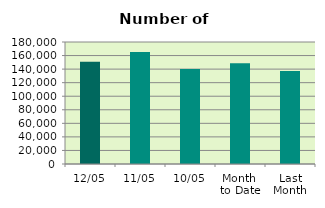
| Category | Series 0 |
|---|---|
| 12/05 | 150840 |
| 11/05 | 165096 |
| 10/05 | 140252 |
| Month 
to Date | 148703 |
| Last
Month | 137031.8 |